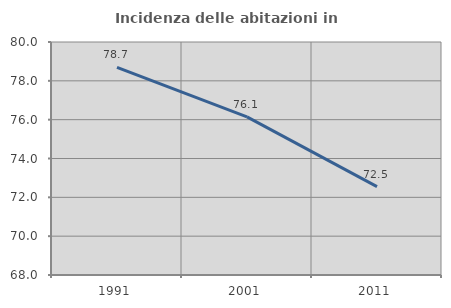
| Category | Incidenza delle abitazioni in proprietà  |
|---|---|
| 1991.0 | 78.696 |
| 2001.0 | 76.147 |
| 2011.0 | 72.549 |